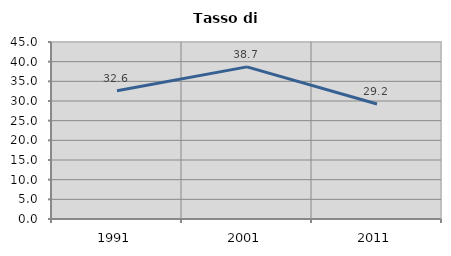
| Category | Tasso di disoccupazione   |
|---|---|
| 1991.0 | 32.622 |
| 2001.0 | 38.674 |
| 2011.0 | 29.235 |